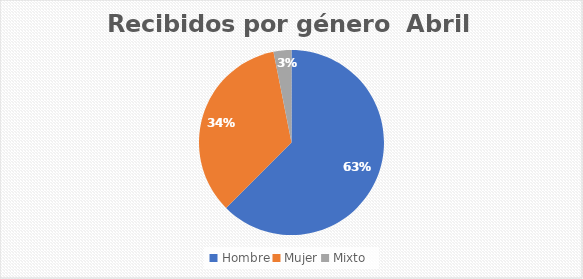
| Category | Recibidos por género  Abril |
|---|---|
| Hombre | 20 |
| Mujer | 11 |
| Mixto | 1 |